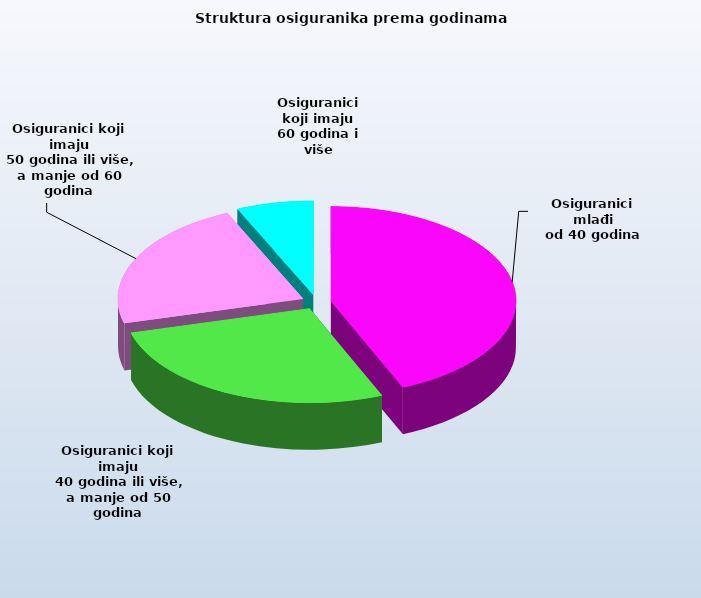
| Category | Series 0 |
|---|---|
| Osiguranici mlađi
od 40 godina | 675892 |
| Osiguranici koji imaju
 40 godina ili više, a manje od 50 godina | 421236 |
| Osiguranici koji imaju
 50 godina ili više, a manje od 60 godina | 348022 |
| Osiguranici koji imaju
60 godina i više | 103927 |